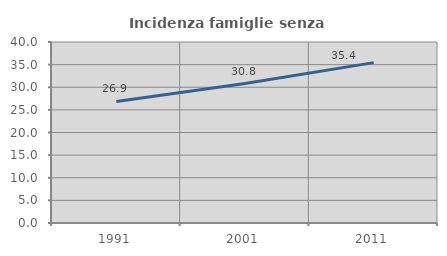
| Category | Incidenza famiglie senza nuclei |
|---|---|
| 1991.0 | 26.859 |
| 2001.0 | 30.82 |
| 2011.0 | 35.443 |